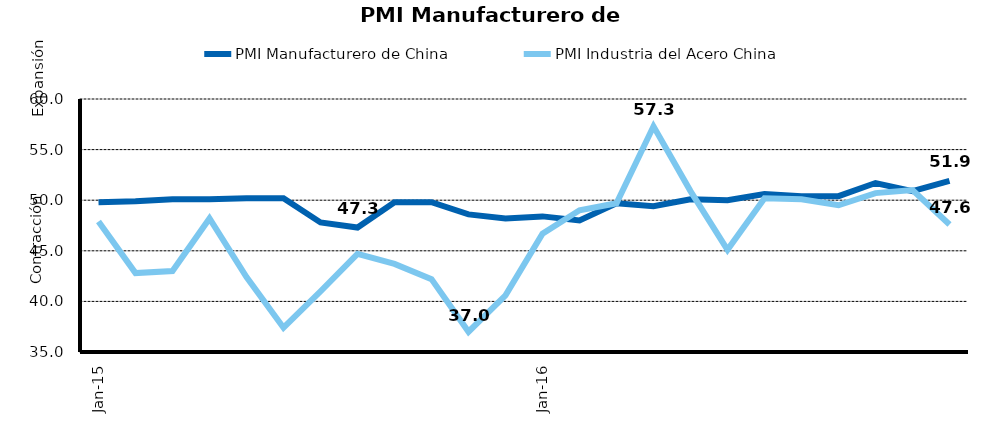
| Category | PMI Manufacturero de China | PMI Industria del Acero China |
|---|---|---|
| 2015-01-01 | 49.8 | 47.9 |
| 2015-02-01 | 49.9 | 42.8 |
| 2015-03-01 | 50.1 | 43 |
| 2015-04-01 | 50.1 | 48.2 |
| 2015-05-01 | 50.2 | 42.4 |
| 2015-06-01 | 50.2 | 37.4 |
| 2015-07-01 | 47.8 | 41 |
| 2015-08-01 | 47.3 | 44.7 |
| 2015-09-01 | 49.8 | 43.7 |
| 2015-10-01 | 49.8 | 42.2 |
| 2015-11-01 | 48.6 | 37 |
| 2015-12-01 | 48.2 | 40.6 |
| 2016-01-01 | 48.4 | 46.7 |
| 2016-02-01 | 48 | 49 |
| 2016-03-01 | 49.7 | 49.7 |
| 2016-04-01 | 49.4 | 57.3 |
| 2016-05-01 | 50.1 | 50.9 |
| 2016-06-01 | 50 | 45.1 |
| 2016-07-01 | 50.6 | 50.2 |
| 2016-08-01 | 50.4 | 50.1 |
| 2016-09-01 | 50.4 | 49.5 |
| 2016-10-01 | 51.7 | 50.7 |
| 2016-11-01 | 50.9 | 51 |
| 2016-12-01 | 51.9 | 47.6 |